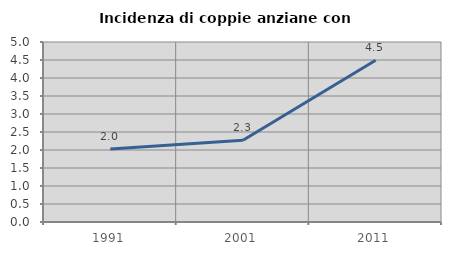
| Category | Incidenza di coppie anziane con figli |
|---|---|
| 1991.0 | 2.029 |
| 2001.0 | 2.273 |
| 2011.0 | 4.494 |